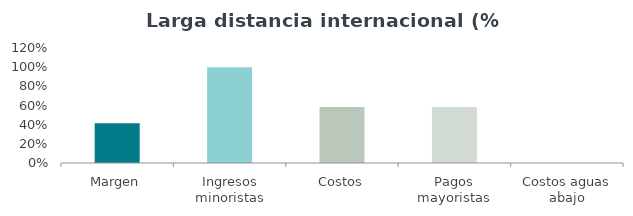
| Category | Series 0 |
|---|---|
| Margen | 0.414 |
| Ingresos minoristas | 1 |
| Costos | 0.586 |
| Pagos mayoristas | 0.585 |
| Costos aguas abajo | 0 |